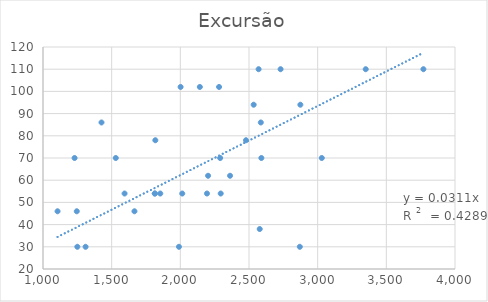
| Category | Excursão |
|---|---|
| 2202.0 | 62 |
| 1310.0 | 30 |
| 2194.0 | 54 |
| 1106.0 | 46 |
| 1814.0 | 54 |
| 2002.0 | 102 |
| 2362.0 | 62 |
| 1230.0 | 70 |
| 2586.0 | 86 |
| 1854.0 | 54 |
| 2534.0 | 94 |
| 2570.0 | 110 |
| 1246.0 | 46 |
| 1990.0 | 30 |
| 1594.0 | 54 |
| 2578.0 | 38 |
| 1530.0 | 70 |
| 2478.0 | 78 |
| 1666.0 | 46 |
| 2282.0 | 102 |
| 2142.0 | 102 |
| 3030.0 | 70 |
| 2590.0 | 70 |
| 2874.0 | 94 |
| 2014.0 | 54 |
| 3350.0 | 110 |
| 1250.0 | 30 |
| 2870.0 | 30 |
| 1814.0 | 54 |
| 3770.0 | 110 |
| 2294.0 | 54 |
| 2730.0 | 110 |
| 2290.0 | 70 |
| 1818.0 | 78 |
| 1426.0 | 86 |